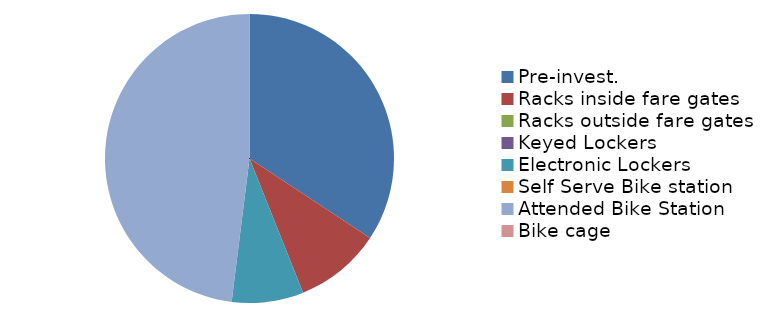
| Category | Daily Bicycle Access Ridership |
|---|---|
| Pre-invest. | 224.906 |
| Racks inside fare gates | 63.375 |
| Racks outside fare gates | 0 |
| Keyed Lockers | 0 |
| Electronic Lockers | 52.65 |
| Self Serve Bike station | 0 |
| Attended Bike Station | 315 |
| Bike cage | 0 |